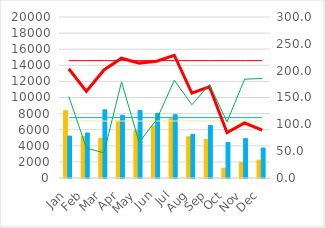
| Category | River: | Bore: |
|---|---|---|
| Jan | 8360 | 5207 |
| Feb | 5163 | 5595 |
| Mar | 4948 | 8469 |
| Apr | 7095 | 7784 |
| May | 5876 | 8396 |
| Jun | 6464 | 8039 |
| Jul | 7382 | 7868 |
| Aug | 5120 | 5429 |
| Sep | 4800 | 6534 |
| Oct | 1217 | 4413 |
| Nov | 1935 | 4896 |
| Dec | 2224 | 3726 |